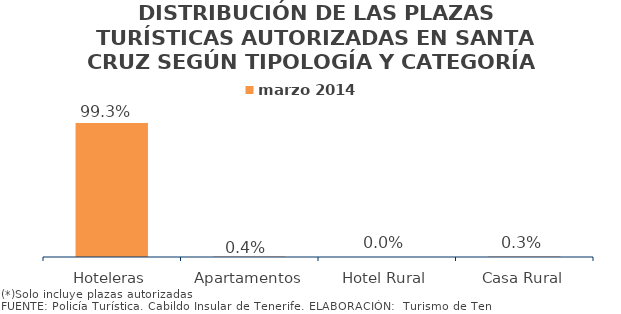
| Category | marzo 2014 |
|---|---|
| Hoteleras | 0.993 |
| Apartamentos | 0.004 |
| Hotel Rural | 0 |
| Casa Rural | 0.003 |